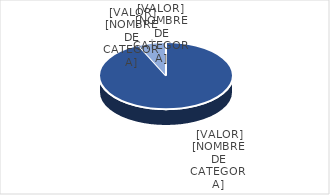
| Category | Series 0 |
|---|---|
| PRESUPUESTO VIGENTE PARA 2023 | 25000000 |
| PRESUPUESTO EJECUTADO  | 1822364.43 |
| PORCENTAJE DE EJECUCIÓN  | 0.073 |